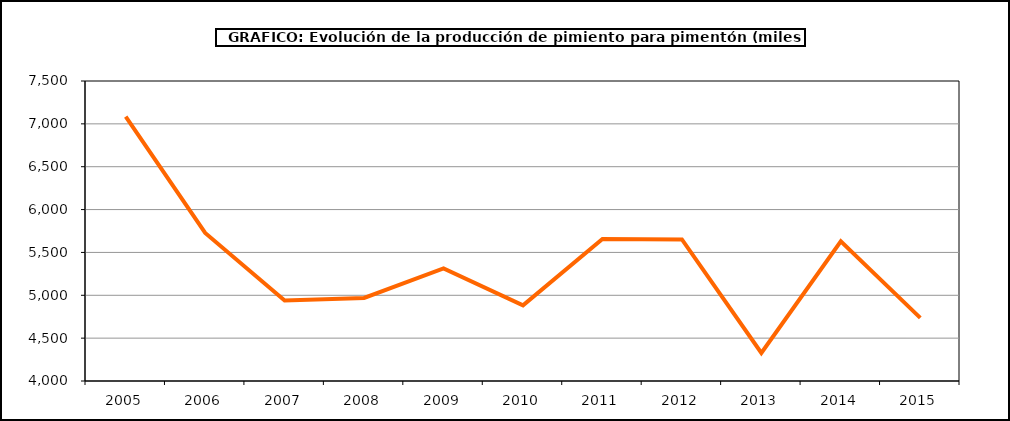
| Category | Producción |
|---|---|
| 2005.0 | 7084 |
| 2006.0 | 5727 |
| 2007.0 | 4939 |
| 2008.0 | 4969 |
| 2009.0 | 5314 |
| 2010.0 | 4882 |
| 2011.0 | 5658 |
| 2012.0 | 5652 |
| 2013.0 | 4327 |
| 2014.0 | 5630 |
| 2015.0 | 4736 |